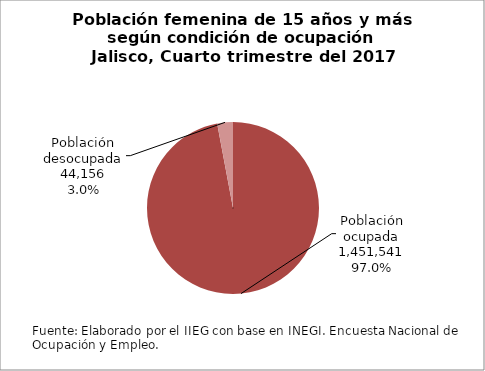
| Category | Series 0 |
|---|---|
| Población ocupada | 1451541 |
| Población desocupada | 44156 |